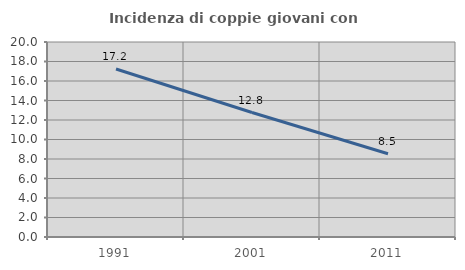
| Category | Incidenza di coppie giovani con figli |
|---|---|
| 1991.0 | 17.228 |
| 2001.0 | 12.764 |
| 2011.0 | 8.538 |